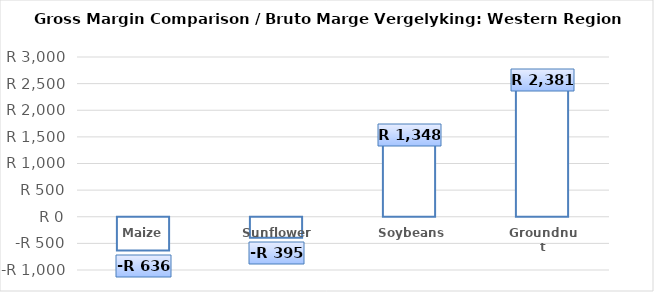
| Category | Series 0 |
|---|---|
| Maize | -635.714 |
| Sunflower | -394.674 |
| Soybeans | 1347.508 |
| Groundnut | 2381.093 |